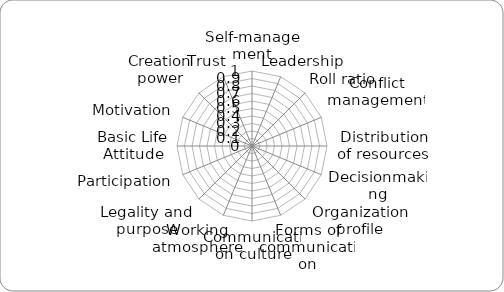
| Category | Meme |
|---|---|
| Self-management | 0 |
| Leadership | 0 |
| Roll ratio | 0 |
| Conflict management | 0 |
| Distribution of resources | 0 |
| Decisionmaking | 0 |
| Organization profile | 0 |
| Forms of communication | 0 |
| Communication culture | 0 |
| Working atmosphere | 0 |
| Legality and purpose | 0 |
| Participation | 0 |
| Basic Life Attitude | 0 |
| Motivation | 0 |
| Creation power | 0 |
| Trust | 0 |